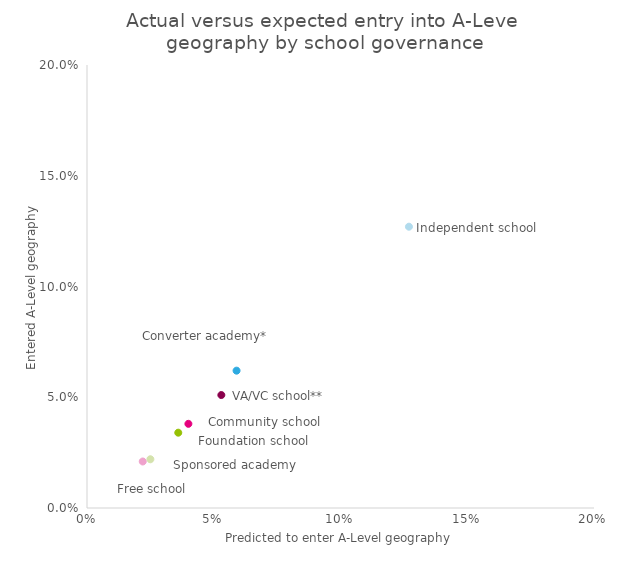
| Category | Series 0 |
|---|---|
| 0.04 | 0.038 |
| 0.059 | 0.062 |
| 0.036 | 0.034 |
| 0.022 | 0.021 |
| 0.127 | 0.127 |
| 0.025 | 0.022 |
| 0.053 | 0.051 |